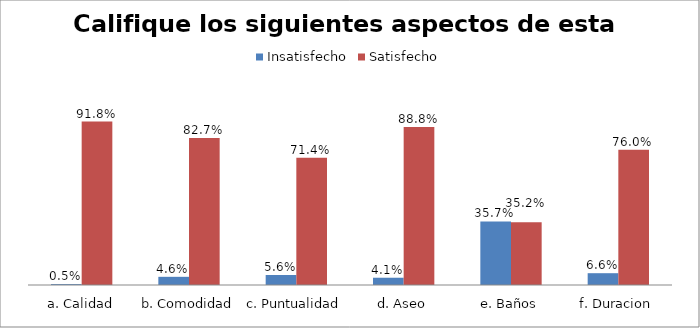
| Category | Insatisfecho | Satisfecho |
|---|---|---|
| a. Calidad | 0.005 | 0.918 |
| b. Comodidad | 0.046 | 0.827 |
| c. Puntualidad | 0.056 | 0.714 |
| d. Aseo | 0.041 | 0.888 |
| e. Baños | 0.357 | 0.352 |
| f. Duracion | 0.066 | 0.76 |